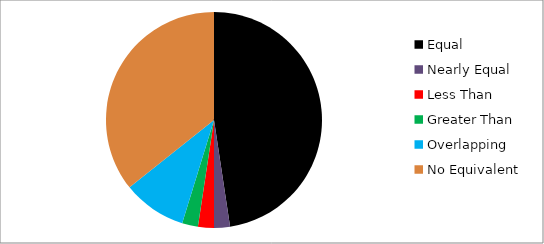
| Category | Series 0 |
|---|---|
| Equal | 20 |
| Nearly Equal | 1 |
| Less Than | 1 |
| Greater Than | 1 |
| Overlapping | 4 |
| No Equivalent | 15 |